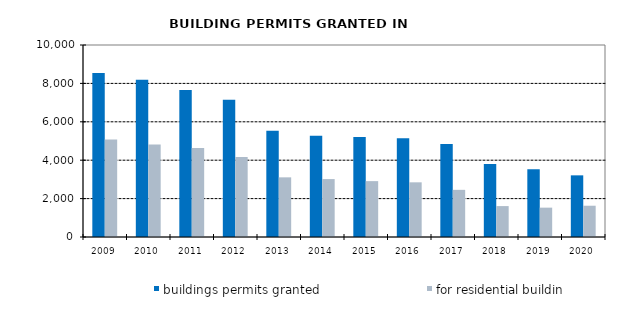
| Category | buildings permits granted | for residential buildings |
|---|---|---|
| 2009.0 | 8538 | 5081 |
| 2010.0 | 8188 | 4819 |
| 2011.0 | 7658 | 4636 |
| 2012.0 | 7147 | 4165 |
| 2013.0 | 5530 | 3107 |
| 2014.0 | 5273 | 3017 |
| 2015.0 | 5211 | 2910 |
| 2016.0 | 5147 | 2848 |
| 2017.0 | 4848 | 2456 |
| 2018.0 | 3805 | 1610 |
| 2019.0 | 3523 | 1529 |
| 2020.0 | 3211 | 1629 |